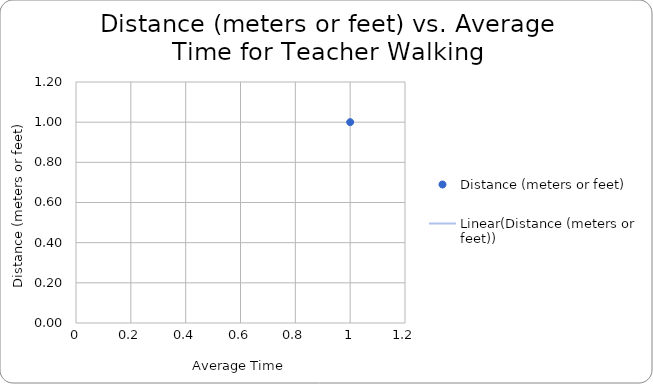
| Category | Distance (meters or feet) |
|---|---|
|  | 1 |
|  | 2 |
|  | 3 |
|  | 4 |
|  | 5 |
|  | 6 |
|  | 7 |
|  | 8 |
|  | 9 |
|  | 10 |